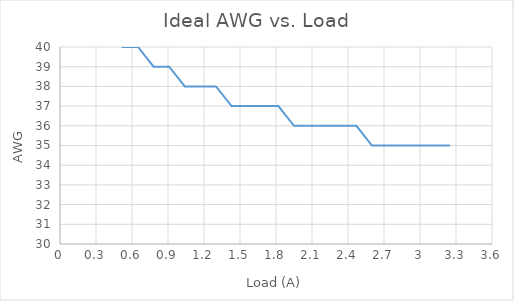
| Category | awg |
|---|---|
| 0.13 | 42 |
| 0.26 | 41 |
| 0.39 | 41 |
| 0.52 | 40 |
| 0.65 | 40 |
| 0.78 | 39 |
| 0.9100000000000001 | 39 |
| 1.04 | 38 |
| 1.17 | 38 |
| 1.3 | 38 |
| 1.43 | 37 |
| 1.56 | 37 |
| 1.69 | 37 |
| 1.8200000000000003 | 37 |
| 1.95 | 36 |
| 2.08 | 36 |
| 2.21 | 36 |
| 2.34 | 36 |
| 2.47 | 36 |
| 2.6 | 35 |
| 2.73 | 35 |
| 2.86 | 35 |
| 2.99 | 35 |
| 3.12 | 35 |
| 3.25 | 35 |